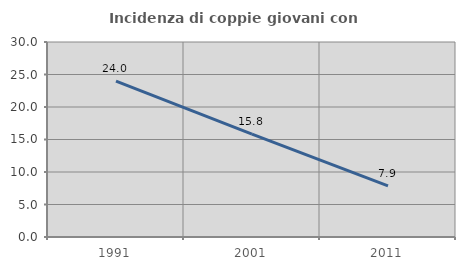
| Category | Incidenza di coppie giovani con figli |
|---|---|
| 1991.0 | 23.97 |
| 2001.0 | 15.815 |
| 2011.0 | 7.857 |